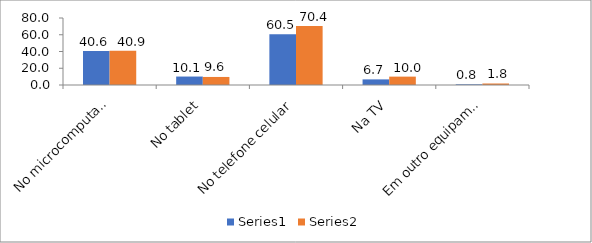
| Category | Series 0 | Series 1 |
|---|---|---|
| No microcomputador | 40.6 | 40.9 |
| No tablet | 10.1 | 9.6 |
| No telefone celular | 60.5 | 70.4 |
| Na TV | 6.7 | 10 |
| Em outro equipamento | 0.8 | 1.8 |